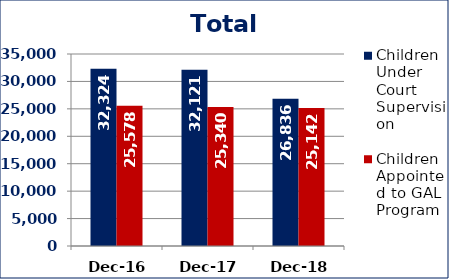
| Category | Children Under Court Supervision  | Children Appointed to GAL Program  |
|---|---|---|
| Dec-16 | 32324 | 25578 |
| Dec-17 | 32121 | 25340 |
| Dec-18 | 26836 | 25142 |